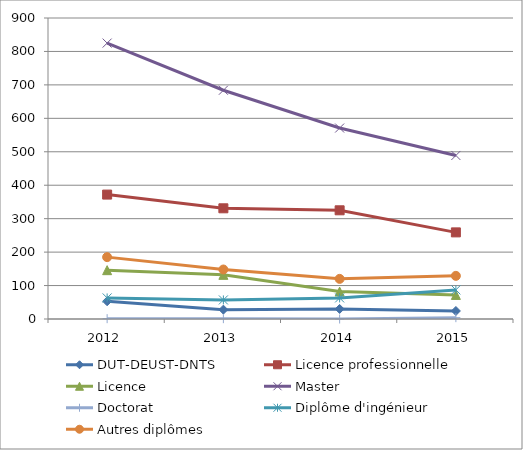
| Category | DUT-DEUST-DNTS | Licence professionnelle | Licence | Master | Doctorat | Diplôme d'ingénieur | Autres diplômes |
|---|---|---|---|---|---|---|---|
| 2012.0 | 53 | 372 | 146 | 825 | 1 | 63 | 185 |
| 2013.0 | 28 | 331 | 132 | 684 | 1 | 57 | 148 |
| 2014.0 | 30 | 325 | 82 | 571 | 0 | 63 | 120 |
| 2015.0 | 24 | 259 | 72 | 489 | 4 | 87 | 129 |